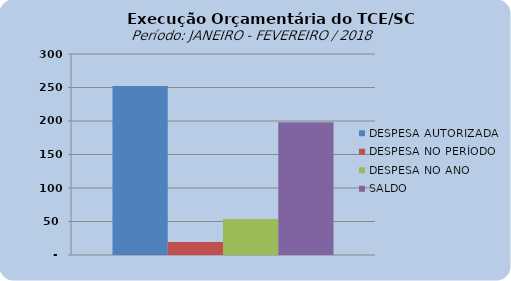
| Category | DESPESA AUTORIZADA | DESPESA NO PERÍODO | DESPESA NO ANO | SALDO |
|---|---|---|---|---|
| 0 | 252189026.82 | 19487903.3 | 53914493.61 | 198274533.21 |